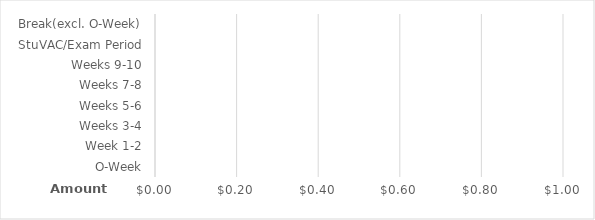
| Category | Amount |
|---|---|
| O-Week | 0 |
| Week 1-2 | 0 |
| Weeks 3-4 | 0 |
| Weeks 5-6 | 0 |
| Weeks 7-8 | 0 |
| Weeks 9-10 | 0 |
| StuVAC/Exam Period | 0 |
| Break(excl. O-Week) | 0 |